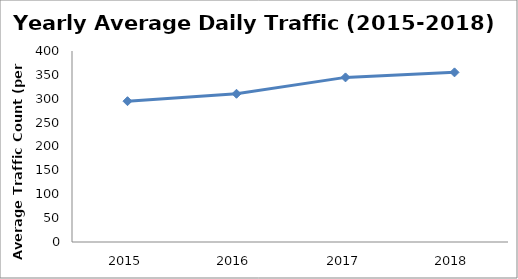
| Category | Series 0 |
|---|---|
| 2015.0 | 294.879 |
| 2016.0 | 310.462 |
| 2017.0 | 344.732 |
| 2018.0 | 355.249 |